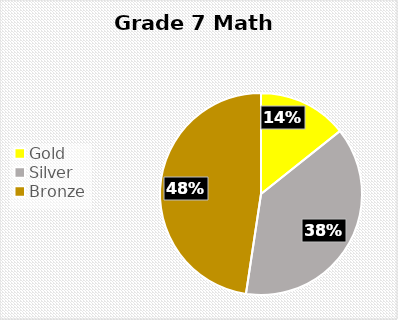
| Category | Series 0 |
|---|---|
| Gold | 3 |
| Silver | 8 |
| Bronze  | 10 |